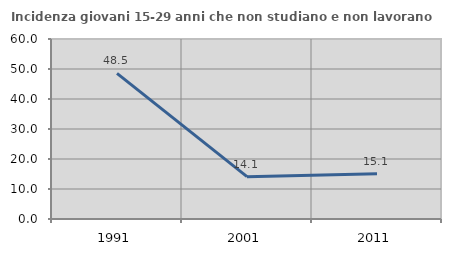
| Category | Incidenza giovani 15-29 anni che non studiano e non lavorano  |
|---|---|
| 1991.0 | 48.533 |
| 2001.0 | 14.114 |
| 2011.0 | 15.102 |